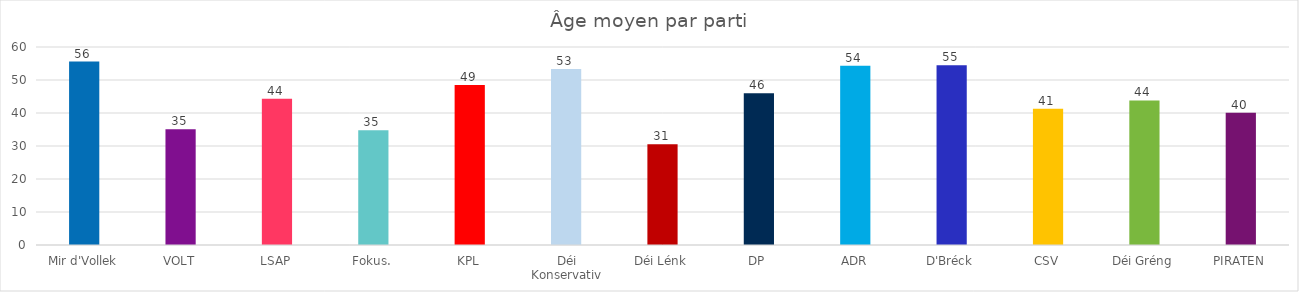
| Category | Âge moyen * |
|---|---|
| Mir d'Vollek | 55.6 |
| VOLT | 35.1 |
| LSAP | 44.3 |
| Fokus. | 34.8 |
| KPL | 48.5 |
| Déi Konservativ | 53.3 |
| Déi Lénk | 30.5 |
| DP | 46 |
| ADR | 54.3 |
| D'Bréck | 54.5 |
| CSV | 41.3 |
| Déi Gréng | 43.8 |
| PIRATEN | 40.1 |